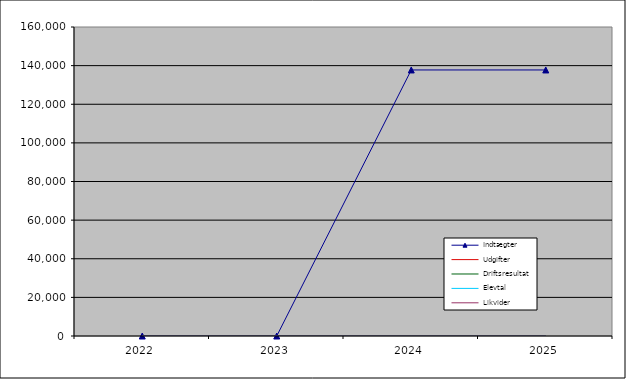
| Category | Indtægter | Udgifter | Driftsresultat | Elevtal | Likvider |
|---|---|---|---|---|---|
| 2022.0 | 0 | 0 | 0 | 0 | 0 |
| 2023.0 | 0 | 0 | 0 | 0 | 0 |
| 2024.0 | 137755 | 0 | 0 | 0 | 0 |
| 2025.0 | 137755 | 0 | 0 | 0 | 0 |